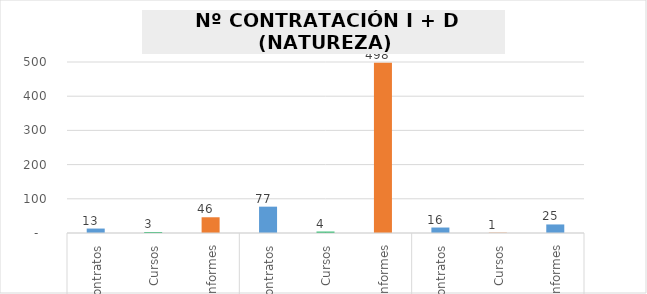
| Category | Series 0 |
|---|---|
| 0 | 13 |
| 1 | 3 |
| 2 | 46 |
| 3 | 77 |
| 4 | 4 |
| 5 | 498 |
| 6 | 16 |
| 7 | 1 |
| 8 | 25 |